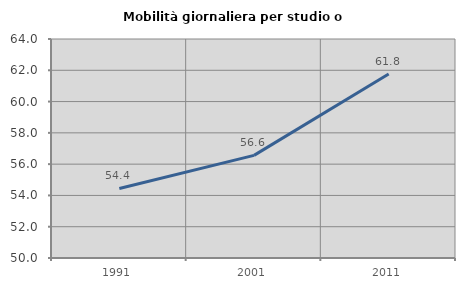
| Category | Mobilità giornaliera per studio o lavoro |
|---|---|
| 1991.0 | 54.446 |
| 2001.0 | 56.562 |
| 2011.0 | 61.759 |